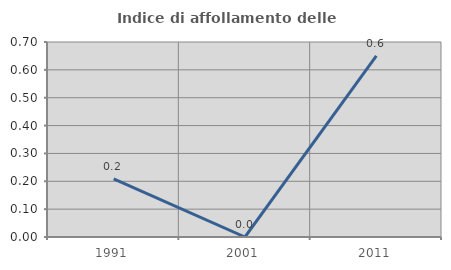
| Category | Indice di affollamento delle abitazioni  |
|---|---|
| 1991.0 | 0.209 |
| 2001.0 | 0 |
| 2011.0 | 0.65 |